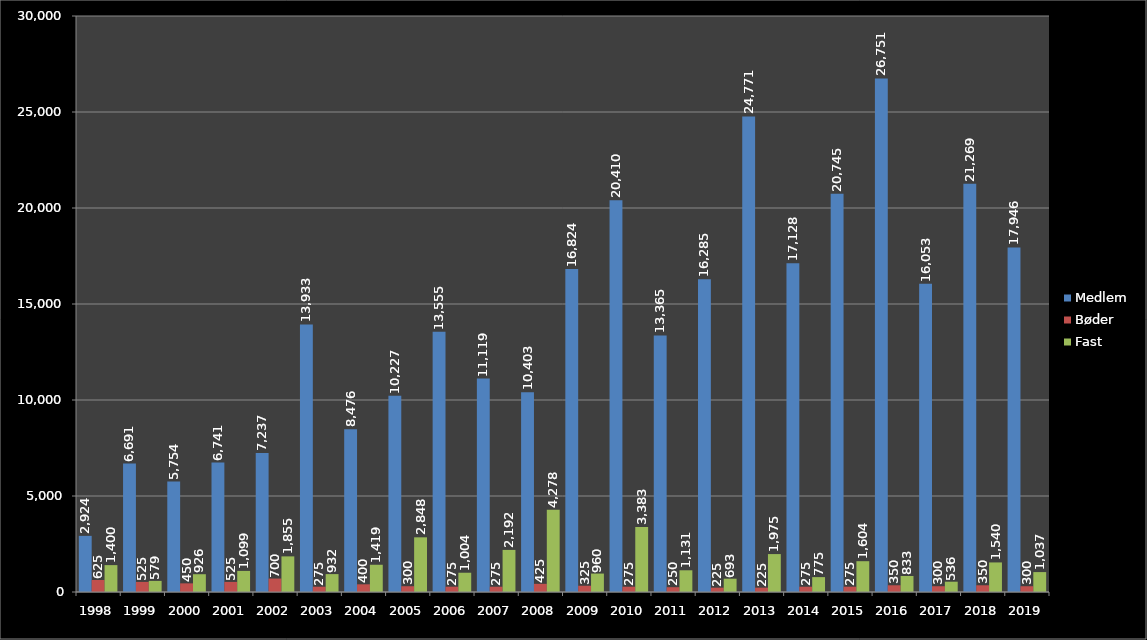
| Category | Medlem | Bøder | Fast |
|---|---|---|---|
| 1998.0 | 2924 | 625 | 1400 |
| 1999.0 | 6691 | 525 | 579 |
| 2000.0 | 5754 | 450 | 926 |
| 2001.0 | 6741 | 525 | 1099 |
| 2002.0 | 7237 | 700 | 1855 |
| 2003.0 | 13933 | 275 | 932 |
| 2004.0 | 8476 | 400 | 1419 |
| 2005.0 | 10227 | 300 | 2848 |
| 2006.0 | 13555 | 275 | 1004 |
| 2007.0 | 11119 | 275 | 2192 |
| 2008.0 | 10403 | 425 | 4278 |
| 2009.0 | 16824 | 325 | 960 |
| 2010.0 | 20410 | 275 | 3383 |
| 2011.0 | 13365 | 250 | 1131 |
| 2012.0 | 16285 | 225 | 693 |
| 2013.0 | 24771 | 225 | 1975 |
| 2014.0 | 17128 | 275 | 775 |
| 2015.0 | 20745 | 275 | 1604 |
| 2016.0 | 26751 | 350 | 833 |
| 2017.0 | 16053 | 300 | 536 |
| 2018.0 | 21269 | 350 | 1540 |
| 2019.0 | 17946 | 300 | 1037 |